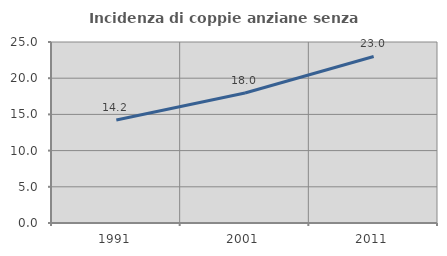
| Category | Incidenza di coppie anziane senza figli  |
|---|---|
| 1991.0 | 14.229 |
| 2001.0 | 17.953 |
| 2011.0 | 23.002 |